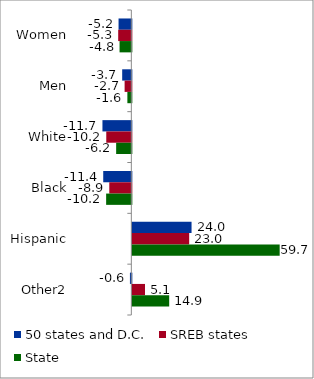
| Category | 50 states and D.C. | SREB states | State |
|---|---|---|---|
| Women | -5.181 | -5.327 | -4.775 |
| Men | -3.71 | -2.725 | -1.607 |
| White | -11.711 | -10.163 | -6.157 |
| Black | -11.397 | -8.938 | -10.214 |
| Hispanic | 24.008 | 23.049 | 59.732 |
| Other2 | -0.568 | 5.138 | 14.943 |